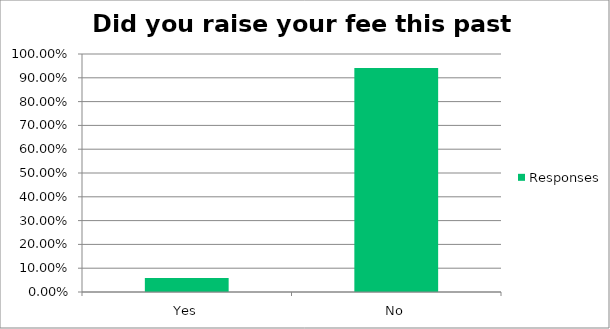
| Category | Responses |
|---|---|
| Yes | 0.059 |
| No | 0.941 |